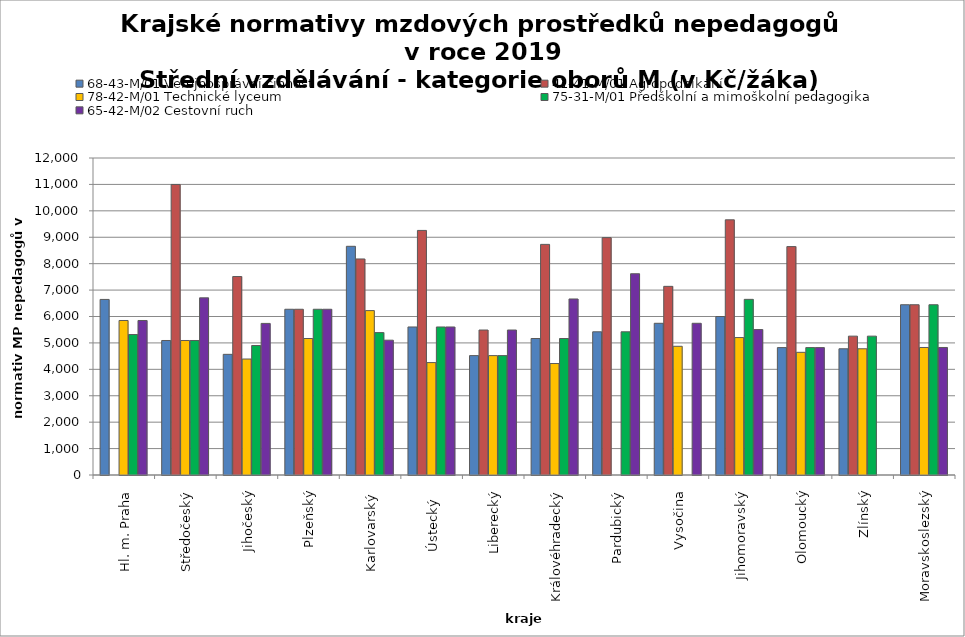
| Category | 68-43-M/01 Veřejnosprávní činnost | 41-41-M/01 Agropodnikání | 78-42-M/01 Technické lyceum | 75-31-M/01 Předškolní a mimoškolní pedagogika | 65-42-M/02 Cestovní ruch |
|---|---|---|---|---|---|
| Hl. m. Praha | 6646.364 | 0 | 5848.8 | 5317.091 | 5848.8 |
| Středočeský | 5091.778 | 10998.24 | 5091.778 | 5091.778 | 6706.244 |
| Jihočeský | 4567.961 | 7512.85 | 4390.463 | 4901.435 | 5738.106 |
| Plzeňský | 6274.286 | 6274.286 | 5167.059 | 6274.286 | 6274.286 |
| Karlovarský  | 8657.143 | 8178.138 | 6223.363 | 5390.26 | 5103.158 |
| Ústecký   | 5603.256 | 9258.228 | 4255.418 | 5603.256 | 5603.256 |
| Liberecký | 4519.364 | 5488.154 | 4519.364 | 4519.364 | 5488.154 |
| Královéhradecký | 5166.944 | 8729.743 | 4220.1 | 5166.944 | 6663.315 |
| Pardubický | 5420.769 | 8985.655 | 0 | 5420.769 | 7618.378 |
| Vysočina | 5742.799 | 7141.48 | 4872.046 | 0 | 5742.799 |
| Jihomoravský | 5999.476 | 9659.852 | 5202.724 | 6649.323 | 5505.826 |
| Olomoucký | 4822.503 | 8645.763 | 4643.892 | 4822.503 | 4822.503 |
| Zlínský | 4778.182 | 5256 | 4778.182 | 5256 | 0 |
| Moravskoslezský | 6445.059 | 6445.059 | 4827.119 | 6445.059 | 4827.119 |